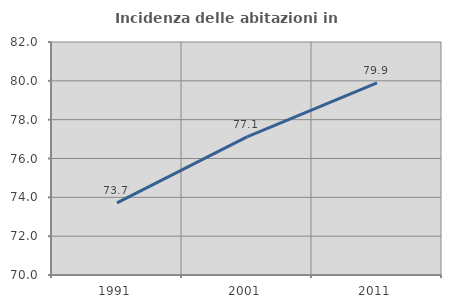
| Category | Incidenza delle abitazioni in proprietà  |
|---|---|
| 1991.0 | 73.717 |
| 2001.0 | 77.115 |
| 2011.0 | 79.9 |